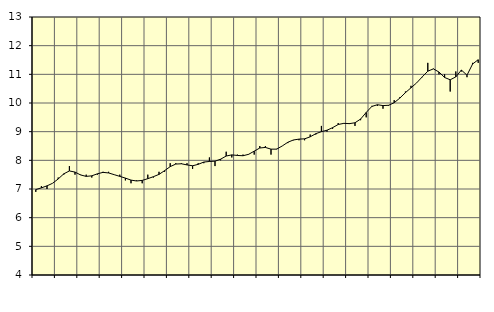
| Category | Piggar | Offentlig förvaltning m.m., SNI 84, 99 |
|---|---|---|
| nan | 6.9 | 6.98 |
| 1.0 | 7.1 | 7.04 |
| 1.0 | 7 | 7.11 |
| 1.0 | 7.2 | 7.2 |
| nan | 7.4 | 7.35 |
| 2.0 | 7.5 | 7.53 |
| 2.0 | 7.8 | 7.63 |
| 2.0 | 7.5 | 7.59 |
| nan | 7.5 | 7.49 |
| 3.0 | 7.5 | 7.44 |
| 3.0 | 7.4 | 7.46 |
| 3.0 | 7.5 | 7.53 |
| nan | 7.6 | 7.58 |
| 4.0 | 7.6 | 7.56 |
| 4.0 | 7.5 | 7.5 |
| 4.0 | 7.5 | 7.44 |
| nan | 7.3 | 7.38 |
| 5.0 | 7.2 | 7.31 |
| 5.0 | 7.3 | 7.28 |
| 5.0 | 7.2 | 7.3 |
| nan | 7.5 | 7.36 |
| 6.0 | 7.4 | 7.43 |
| 6.0 | 7.6 | 7.51 |
| 6.0 | 7.6 | 7.64 |
| nan | 7.9 | 7.78 |
| 7.0 | 7.9 | 7.87 |
| 7.0 | 7.9 | 7.88 |
| 7.0 | 7.9 | 7.84 |
| nan | 7.7 | 7.81 |
| 8.0 | 7.9 | 7.86 |
| 8.0 | 7.9 | 7.94 |
| 8.0 | 8.1 | 7.96 |
| nan | 7.8 | 7.97 |
| 9.0 | 8 | 8.04 |
| 9.0 | 8.3 | 8.15 |
| 9.0 | 8.1 | 8.19 |
| nan | 8.2 | 8.17 |
| 10.0 | 8.2 | 8.16 |
| 10.0 | 8.2 | 8.21 |
| 10.0 | 8.2 | 8.32 |
| nan | 8.5 | 8.43 |
| 11.0 | 8.5 | 8.45 |
| 11.0 | 8.2 | 8.39 |
| 11.0 | 8.4 | 8.39 |
| nan | 8.5 | 8.5 |
| 12.0 | 8.6 | 8.63 |
| 12.0 | 8.7 | 8.71 |
| 12.0 | 8.7 | 8.74 |
| nan | 8.7 | 8.75 |
| 13.0 | 8.9 | 8.82 |
| 13.0 | 8.9 | 8.93 |
| 13.0 | 9.2 | 9 |
| nan | 9 | 9.05 |
| 14.0 | 9.1 | 9.14 |
| 14.0 | 9.3 | 9.25 |
| 14.0 | 9.3 | 9.29 |
| nan | 9.3 | 9.28 |
| 15.0 | 9.2 | 9.31 |
| 15.0 | 9.4 | 9.44 |
| 15.0 | 9.5 | 9.67 |
| nan | 9.9 | 9.88 |
| 16.0 | 9.9 | 9.94 |
| 16.0 | 9.8 | 9.91 |
| 16.0 | 9.9 | 9.92 |
| nan | 10.1 | 10.01 |
| 17.0 | 10.2 | 10.17 |
| 17.0 | 10.4 | 10.36 |
| 17.0 | 10.6 | 10.53 |
| nan | 10.7 | 10.7 |
| 18.0 | 10.9 | 10.91 |
| 18.0 | 11.4 | 11.11 |
| 18.0 | 11.2 | 11.19 |
| nan | 11 | 11.08 |
| 19.0 | 11 | 10.89 |
| 19.0 | 10.4 | 10.81 |
| 19.0 | 11.1 | 10.91 |
| nan | 11.1 | 11.15 |
| 20.0 | 10.9 | 10.97 |
| 20.0 | 11.4 | 11.36 |
| 20.0 | 11.4 | 11.51 |